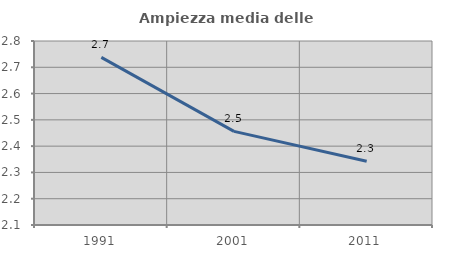
| Category | Ampiezza media delle famiglie |
|---|---|
| 1991.0 | 2.738 |
| 2001.0 | 2.456 |
| 2011.0 | 2.343 |